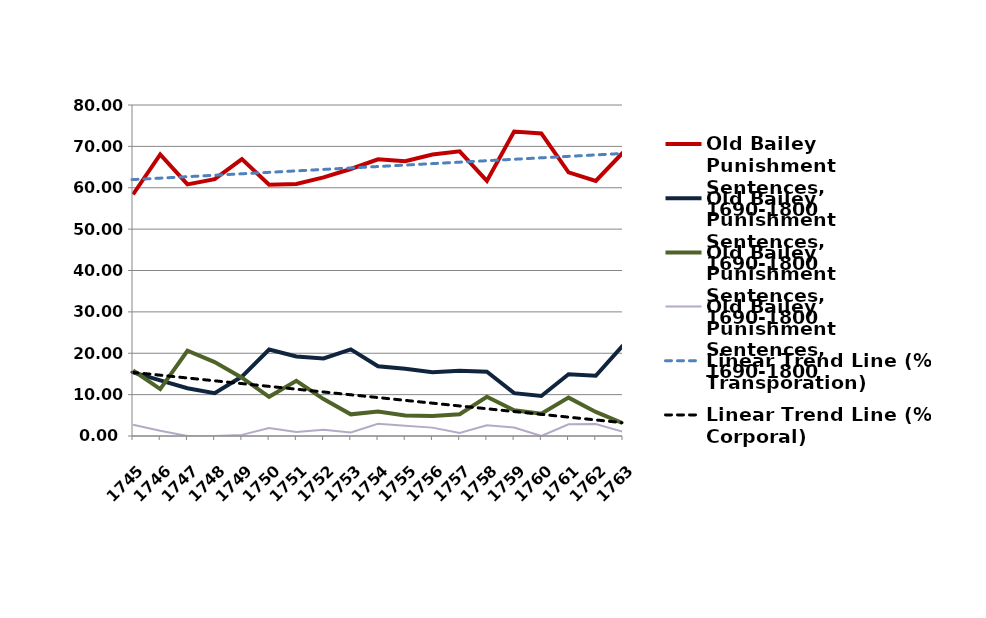
| Category | Old Bailey Punishment Sentences, 1690-1800 |
|---|---|
| 1745 | 2.715 |
| 1746 | 1.261 |
| 1747 | 0 |
| 1748 | 0 |
| 1749 | 0.271 |
| 1750 | 1.95 |
| 1751 | 0.977 |
| 1752 | 1.488 |
| 1753 | 0.872 |
| 1754 | 2.959 |
| 1755 | 2.473 |
| 1756 | 2.024 |
| 1757 | 0.752 |
| 1758 | 2.586 |
| 1759 | 2.073 |
| 1760 | 0 |
| 1761 | 2.823 |
| 1762 | 2.913 |
| 1763 | 1 |